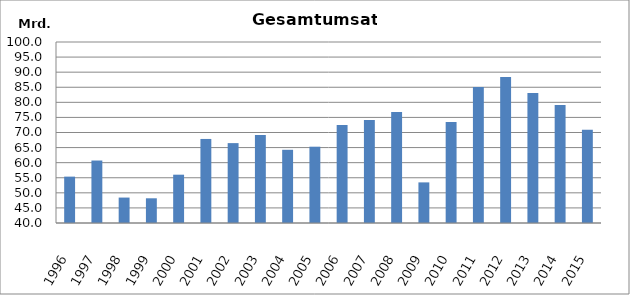
| Category | Series 0 |
|---|---|
| 1996.0 | 55371956 |
| 1997.0 | 60710454 |
| 1998.0 | 48430705 |
| 1999.0 | 48190293 |
| 2000.0 | 56014702 |
| 2001.0 | 67861795 |
| 2002.0 | 66481294 |
| 2003.0 | 69161973 |
| 2004.0 | 64266307 |
| 2005.0 | 65293897 |
| 2006.0 | 72514648 |
| 2007.0 | 74176770 |
| 2008.0 | 76788139 |
| 2009.0 | 53462495 |
| 2010.0 | 73497409.496 |
| 2011.0 | 85064473 |
| 2012.0 | 88419481 |
| 2013.0 | 83060160.429 |
| 2014.0 | 79153644.015 |
| 2015.0 | 70914314 |